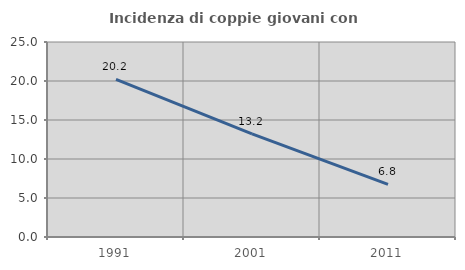
| Category | Incidenza di coppie giovani con figli |
|---|---|
| 1991.0 | 20.198 |
| 2001.0 | 13.232 |
| 2011.0 | 6.75 |